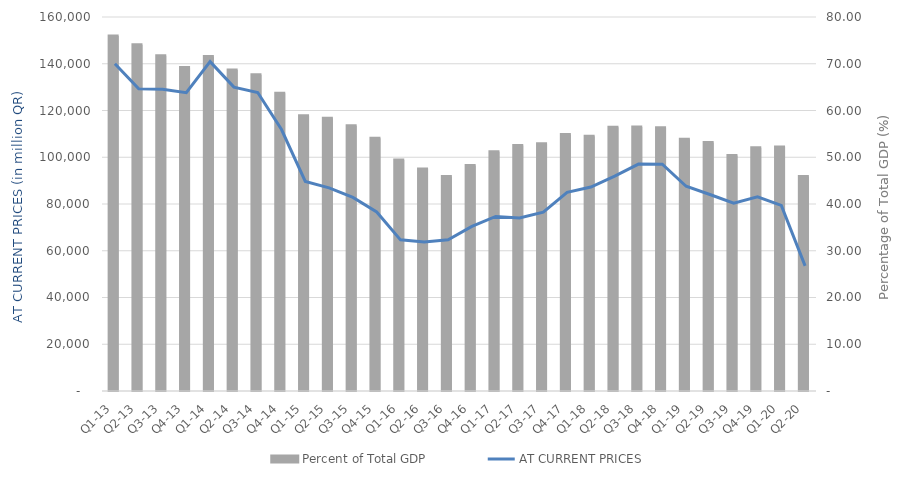
| Category | Percent of Total GDP |
|---|---|
| Q1-13 | 75.946 |
| Q2-13 | 74.046 |
| Q3-13 | 71.703 |
| Q4-13 | 69.223 |
| Q1-14 | 71.559 |
| Q2-14 | 68.65 |
| Q3-14 | 67.631 |
| Q4-14 | 63.697 |
| Q1-15 | 58.871 |
| Q2-15 | 58.366 |
| Q3-15 | 56.736 |
| Q4-15 | 54.08 |
| Q1-16 | 49.401 |
| Q2-16 | 47.461 |
| Q3-16 | 45.856 |
| Q4-16 | 48.228 |
| Q1-17 | 51.151 |
| Q2-17 | 52.494 |
| Q3-17 | 52.903 |
| Q4-17 | 54.876 |
| Q1-18 | 54.493 |
| Q2-18 | 56.411 |
| Q3-18 | 56.463 |
| Q4-18 | 56.326 |
| Q1-19 | 53.833 |
| Q2-19 | 53.151 |
| Q3-19 | 50.349 |
| Q4-19 | 52.034 |
| Q1-20 | 52.167 |
| Q2-20 | 45.9 |